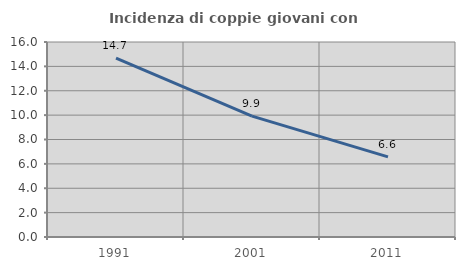
| Category | Incidenza di coppie giovani con figli |
|---|---|
| 1991.0 | 14.673 |
| 2001.0 | 9.92 |
| 2011.0 | 6.573 |